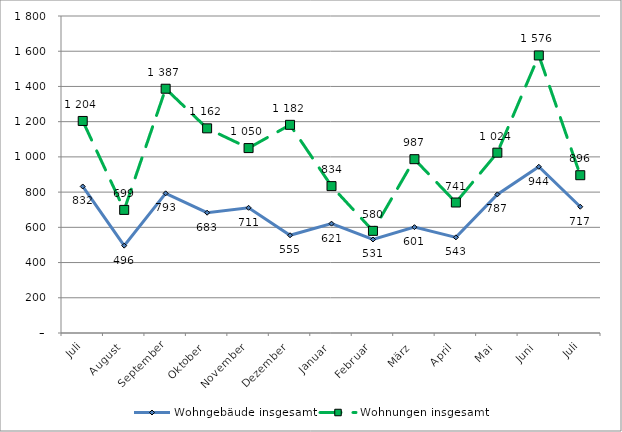
| Category | Wohngebäude insgesamt | Wohnungen insgesamt |
|---|---|---|
| Juli | 832 | 1204 |
| August | 496 | 699 |
| September | 793 | 1387 |
| Oktober | 683 | 1162 |
| November | 711 | 1050 |
| Dezember | 555 | 1182 |
| Januar | 621 | 834 |
| Februar | 531 | 580 |
| März | 601 | 987 |
| April | 543 | 741 |
| Mai | 787 | 1024 |
| Juni | 944 | 1576 |
| Juli | 717 | 896 |